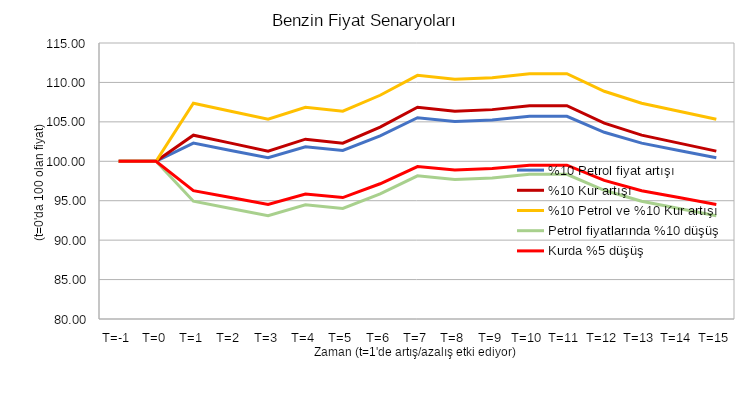
| Category | %10 Petrol fiyat artışı | %10 Kur artışı | %10 Petrol ve %10 Kur artışı | Petrol fiyatlarında %10 düşüş | Kurda %5 düşüş |
|---|---|---|---|---|---|
| T=-1 | 100 | 100 | 100 | 100 | 100 |
| T=0 | 100 | 100 | 100 | 100 | 100 |
| T=1 | 102.3 | 103.312 | 107.361 | 94.94 | 96.274 |
| T=2 | 101.38 | 102.3 | 106.348 | 94.02 | 95.4 |
| T=3 | 100.46 | 101.288 | 105.336 | 93.1 | 94.526 |
| T=4 | 101.84 | 102.806 | 106.854 | 94.48 | 95.837 |
| T=5 | 101.38 | 102.3 | 106.348 | 94.02 | 95.4 |
| T=6 | 103.22 | 104.324 | 108.373 | 95.86 | 97.148 |
| T=7 | 105.52 | 106.854 | 110.903 | 98.16 | 99.333 |
| T=8 | 105.06 | 106.348 | 110.397 | 97.7 | 98.896 |
| T=9 | 105.244 | 106.551 | 110.599 | 97.884 | 99.071 |
| T=10 | 105.704 | 107.057 | 111.105 | 98.344 | 99.508 |
| T=11 | 105.704 | 107.057 | 111.105 | 98.344 | 99.508 |
| T=12 | 103.68 | 104.83 | 108.879 | 96.32 | 97.585 |
| T=13 | 102.3 | 103.312 | 107.361 | 94.94 | 96.274 |
| T=14 | 101.38 | 102.3 | 106.348 | 94.02 | 95.4 |
| T=15 | 100.46 | 101.288 | 105.336 | 93.1 | 94.526 |